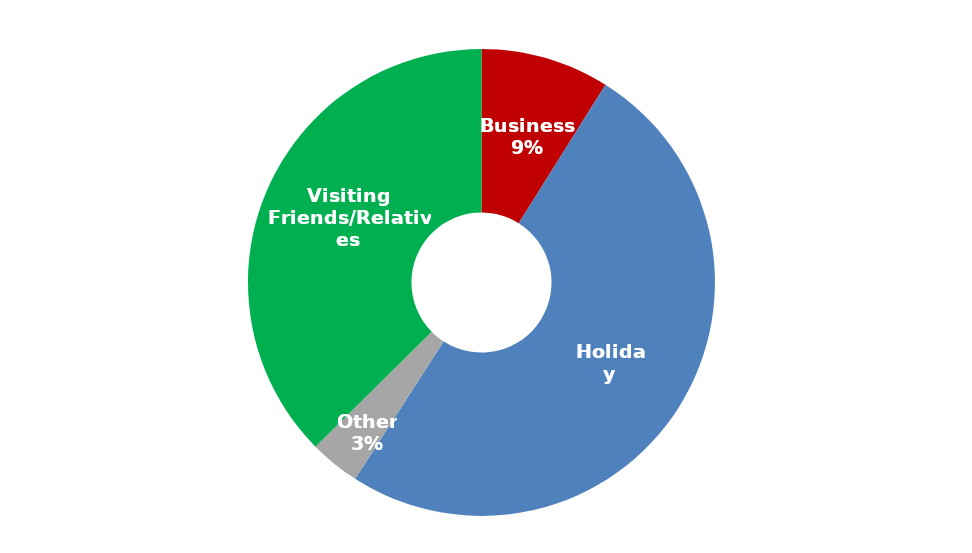
| Category | April 2017 - March 2018 |
|---|---|
| Business | 431232.684 |
| Holiday | 2429264.363 |
| Other | 169180.415 |
| Visiting Friends/Relatives | 1810534.628 |